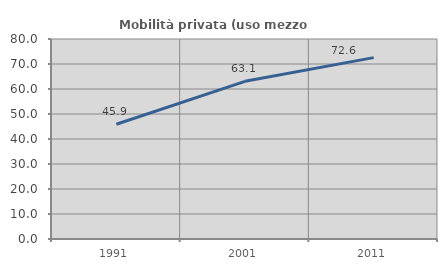
| Category | Mobilità privata (uso mezzo privato) |
|---|---|
| 1991.0 | 45.907 |
| 2001.0 | 63.063 |
| 2011.0 | 72.558 |